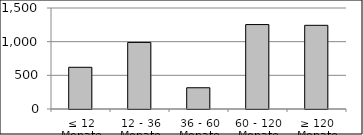
| Category | Volumen |
|---|---|
| ≤ 12 Monate | 619381285.37 |
| 12 - 36 Monate | 988764426.99 |
| 36 - 60 Monate | 315464694.91 |
| 60 - 120 Monate | 1254017990.034 |
| ≥ 120 Monate | 1242800211.301 |